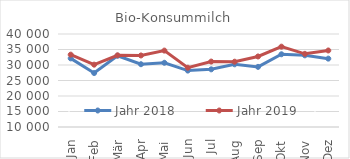
| Category | Jahr 2018 | Jahr 2019 |
|---|---|---|
| 0 | 32136.672 | 33332.698 |
| 1 | 27406.427 | 30106.939 |
| 2 | 32994.638 | 33123.848 |
| 3 | 30253.248 | 33076.386 |
| 4 | 30717.736 | 34645.953 |
| 5 | 28199.517 | 29120.205 |
| 6 | 28600.797 | 31106.385 |
| 7 | 30222.59 | 31059.872 |
| 8 | 29396.854 | 32752.548 |
| 9 | 33462.093 | 35914.771 |
| 10 | 33118.164 | 33601.983 |
| 11 | 32051.477 | 34684.642 |